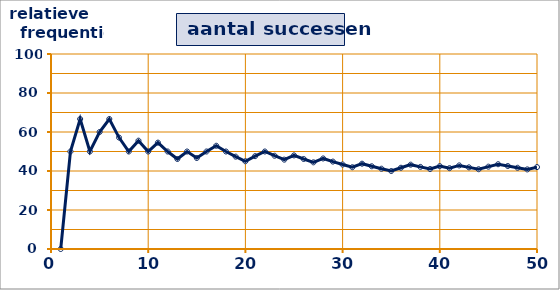
| Category | % |
|---|---|
| 1.0 | 0 |
| 2.0 | 50 |
| 3.0 | 66.667 |
| 4.0 | 50 |
| 5.0 | 60 |
| 6.0 | 66.667 |
| 7.0 | 57.143 |
| 8.0 | 50 |
| 9.0 | 55.556 |
| 10.0 | 50 |
| 11.0 | 54.545 |
| 12.0 | 50 |
| 13.0 | 46.154 |
| 14.0 | 50 |
| 15.0 | 46.667 |
| 16.0 | 50 |
| 17.0 | 52.941 |
| 18.0 | 50 |
| 19.0 | 47.368 |
| 20.0 | 45 |
| 21.0 | 47.619 |
| 22.0 | 50 |
| 23.0 | 47.826 |
| 24.0 | 45.833 |
| 25.0 | 48 |
| 26.0 | 46.154 |
| 27.0 | 44.444 |
| 28.0 | 46.429 |
| 29.0 | 44.828 |
| 30.0 | 43.333 |
| 31.0 | 41.935 |
| 32.0 | 43.75 |
| 33.0 | 42.424 |
| 34.0 | 41.176 |
| 35.0 | 40 |
| 36.0 | 41.667 |
| 37.0 | 43.243 |
| 38.0 | 42.105 |
| 39.0 | 41.026 |
| 40.0 | 42.5 |
| 41.0 | 41.463 |
| 42.0 | 42.857 |
| 43.0 | 41.86 |
| 44.0 | 40.909 |
| 45.0 | 42.222 |
| 46.0 | 43.478 |
| 47.0 | 42.553 |
| 48.0 | 41.667 |
| 49.0 | 40.816 |
| 50.0 | 42 |